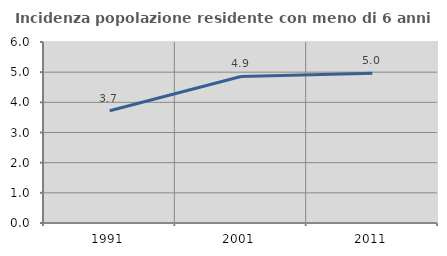
| Category | Incidenza popolazione residente con meno di 6 anni |
|---|---|
| 1991.0 | 3.72 |
| 2001.0 | 4.857 |
| 2011.0 | 4.962 |